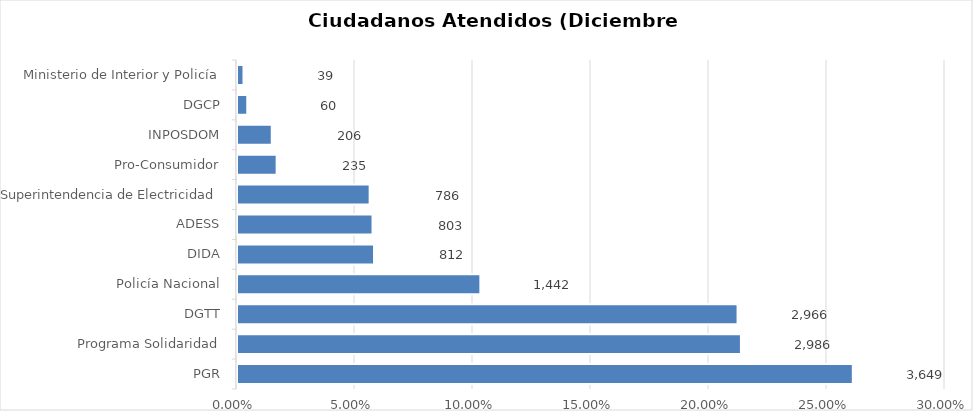
| Category | Porcentaje |
|---|---|
| PGR | 0.261 |
| Programa Solidaridad | 0.214 |
| DGTT | 0.212 |
| Policía Nacional | 0.103 |
| DIDA | 0.058 |
| ADESS | 0.057 |
| Superintendencia de Electricidad | 0.056 |
| Pro-Consumidor | 0.017 |
| INPOSDOM | 0.015 |
| DGCP | 0.004 |
| Ministerio de Interior y Policía | 0.003 |